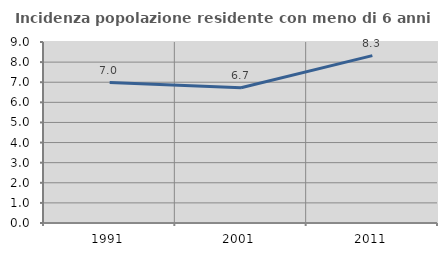
| Category | Incidenza popolazione residente con meno di 6 anni |
|---|---|
| 1991.0 | 6.982 |
| 2001.0 | 6.723 |
| 2011.0 | 8.323 |